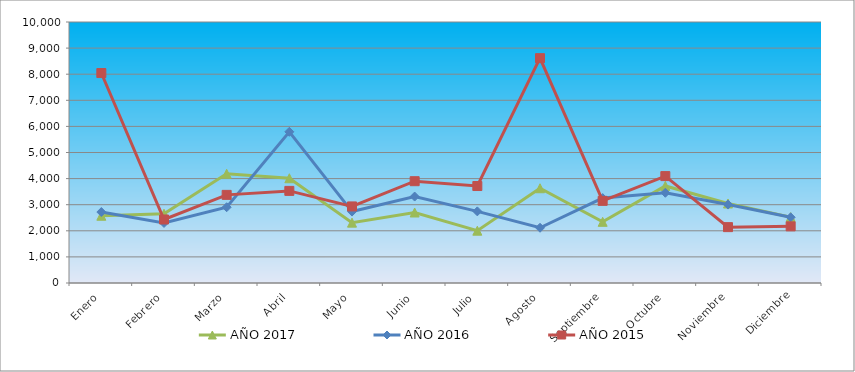
| Category | AÑO 2017 | AÑO 2016 | AÑO 2015 |
|---|---|---|---|
| Enero | 2576.732 | 2718.687 | 8044.738 |
| Febrero | 2653.932 | 2300.33 | 2433.546 |
| Marzo | 4185.42 | 2903.411 | 3376.74 |
| Abril | 4012.849 | 5792.629 | 3529.162 |
| Mayo | 2312.899 | 2736.82 | 2933.803 |
| Junio | 2701.429 | 3312.149 | 3900.447 |
| Julio | 2004.878 | 2744.783 | 3715.456 |
| Agosto | 3630.455 | 2116.729 | 8614.208 |
| Septiembre | 2344.286 | 3253.352 | 3147.455 |
| Octubre | 3719.053 | 3456.713 | 4095.861 |
| Noviembre | 3046.42 | 3005.011 | 2140.426 |
| Diciembre | 2524.725 | 2516.977 | 2170.389 |